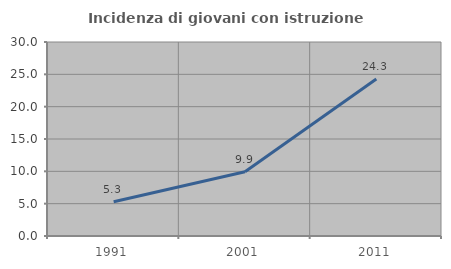
| Category | Incidenza di giovani con istruzione universitaria |
|---|---|
| 1991.0 | 5.294 |
| 2001.0 | 9.929 |
| 2011.0 | 24.265 |